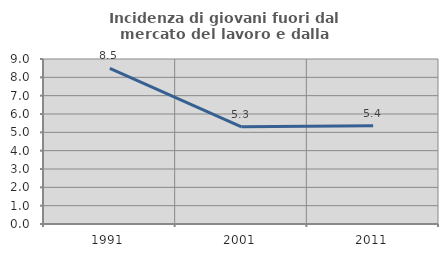
| Category | Incidenza di giovani fuori dal mercato del lavoro e dalla formazione  |
|---|---|
| 1991.0 | 8.494 |
| 2001.0 | 5.3 |
| 2011.0 | 5.364 |